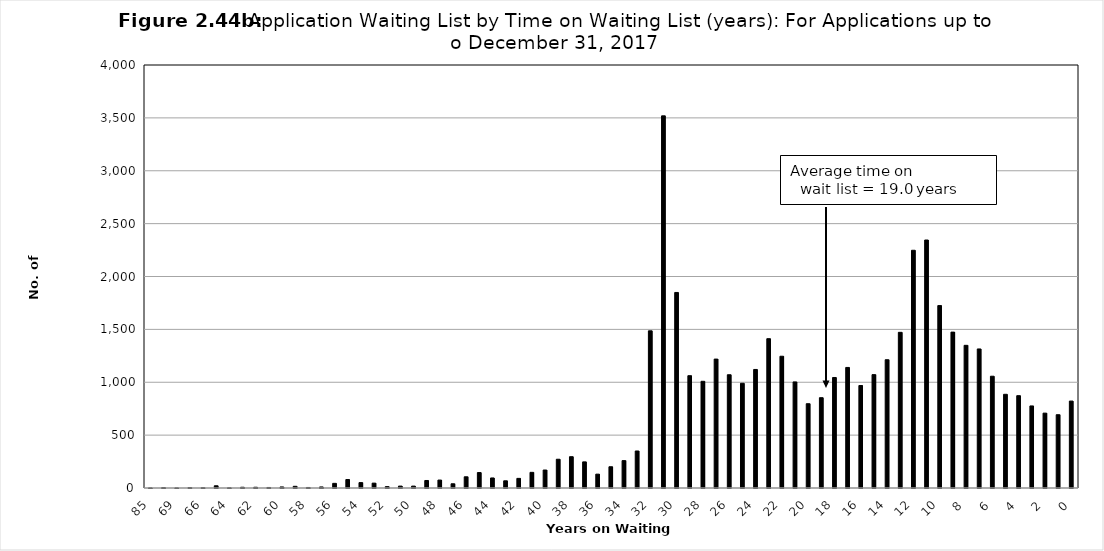
| Category | Series 0 |
|---|---|
| 85.0 | 1 |
| 70.0 | 4 |
| 69.0 | 1 |
| 67.0 | 4 |
| 66.0 | 3 |
| 65.0 | 21 |
| 64.0 | 2 |
| 63.0 | 7 |
| 62.0 | 7 |
| 61.0 | 5 |
| 60.0 | 10 |
| 59.0 | 16 |
| 58.0 | 5 |
| 57.0 | 10 |
| 56.0 | 44 |
| 55.0 | 80 |
| 54.0 | 51 |
| 53.0 | 46 |
| 52.0 | 13 |
| 51.0 | 18 |
| 50.0 | 18 |
| 49.0 | 71 |
| 48.0 | 75 |
| 47.0 | 40 |
| 46.0 | 106 |
| 45.0 | 146 |
| 44.0 | 95 |
| 43.0 | 68 |
| 42.0 | 91 |
| 41.0 | 148 |
| 40.0 | 170 |
| 39.0 | 272 |
| 38.0 | 296 |
| 37.0 | 247 |
| 36.0 | 131 |
| 35.0 | 201 |
| 34.0 | 259 |
| 33.0 | 350 |
| 32.0 | 1486 |
| 31.0 | 3519 |
| 30.0 | 1849 |
| 29.0 | 1062 |
| 28.0 | 1009 |
| 27.0 | 1219 |
| 26.0 | 1071 |
| 25.0 | 990 |
| 24.0 | 1121 |
| 23.0 | 1412 |
| 22.0 | 1246 |
| 21.0 | 1003 |
| 20.0 | 797 |
| 19.0 | 854 |
| 18.0 | 1045 |
| 17.0 | 1140 |
| 16.0 | 969 |
| 15.0 | 1072 |
| 14.0 | 1213 |
| 13.0 | 1472 |
| 12.0 | 2248 |
| 11.0 | 2345 |
| 10.0 | 1725 |
| 9.0 | 1474 |
| 8.0 | 1349 |
| 7.0 | 1315 |
| 6.0 | 1057 |
| 5.0 | 886 |
| 4.0 | 873 |
| 3.0 | 776 |
| 2.0 | 708 |
| 1.0 | 693 |
| 0.0 | 822 |